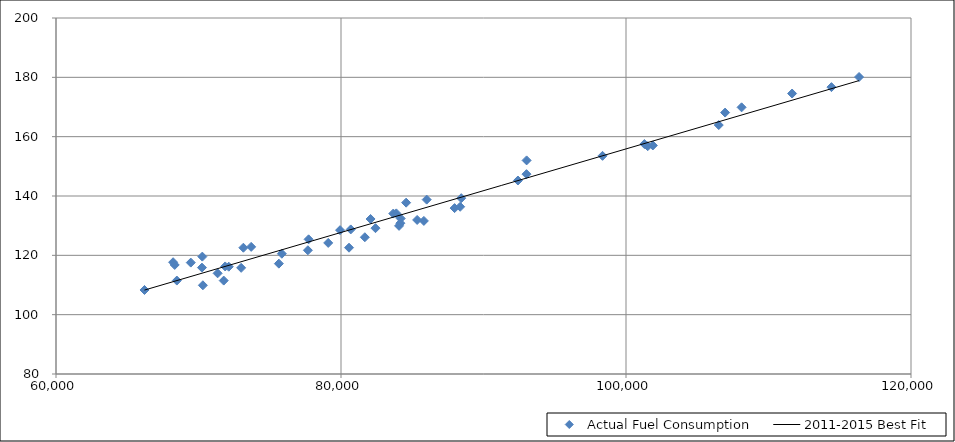
| Category | Actual Fuel Consumption |
|---|---|
| 66210.2513212537 | 108.319 |
| 68218.81620904297 | 117.675 |
| 68330.46470531521 | 116.758 |
| 68480.21156406909 | 111.497 |
| 69458.76083200515 | 117.551 |
| 70241.93547442985 | 115.859 |
| 70268.91575507841 | 119.566 |
| 70307.83810472957 | 109.904 |
| 71341.710550733 | 113.937 |
| 71769.82693465035 | 111.487 |
| 71872.86339622246 | 116.254 |
| 72123.65590428446 | 116.164 |
| 72993.72189759304 | 115.786 |
| 73148.47124442368 | 122.564 |
| 73694.79953503388 | 122.853 |
| 75640.22744567797 | 117.203 |
| 75849.36996238948 | 120.543 |
| 77675.76590349196 | 121.703 |
| 77727.45063696856 | 125.391 |
| 79102.96477186255 | 124.182 |
| 79935.6730527035 | 128.491 |
| 80564.5153344364 | 122.573 |
| 80683.3496955949 | 128.733 |
| 81672.66599665523 | 126.098 |
| 82073.88127314839 | 132.251 |
| 82420.49781480498 | 129.151 |
| 83669.72476515926 | 134.084 |
| 83883.45788526449 | 134.138 |
| 84075.37101416956 | 129.932 |
| 84167.51880830315 | 130.827 |
| 84191.1000153234 | 132.418 |
| 84570.34309057552 | 137.757 |
| 85344.08176922471 | 131.93 |
| 85815.41549549287 | 131.605 |
| 86012.7247361311 | 138.782 |
| 87972.01668434386 | 135.919 |
| 88363.34850069479 | 136.374 |
| 88436.64039430852 | 139.266 |
| 92416.78868839475 | 145.22 |
| 93017.23969166633 | 147.359 |
| 93025.86189642448 | 152.001 |
| 98353.40669312127 | 153.54 |
| 101290.71291210594 | 157.509 |
| 101524.52227410626 | 156.79 |
| 101884.48681051694 | 157.04 |
| 106509.83689067572 | 163.922 |
| 106955.79679454504 | 168.117 |
| 108111.16537994647 | 169.887 |
| 111655.90561971116 | 174.544 |
| 114416.84279844107 | 176.695 |
| 116354.16665800936 | 180.115 |